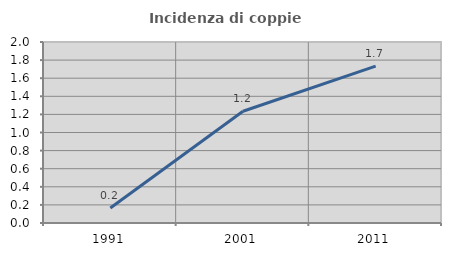
| Category | Incidenza di coppie miste |
|---|---|
| 1991.0 | 0.167 |
| 2001.0 | 1.235 |
| 2011.0 | 1.734 |